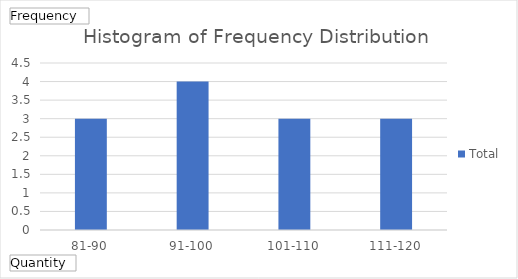
| Category | Total |
|---|---|
| 81-90 | 3 |
| 91-100 | 4 |
| 101-110 | 3 |
| 111-120 | 3 |